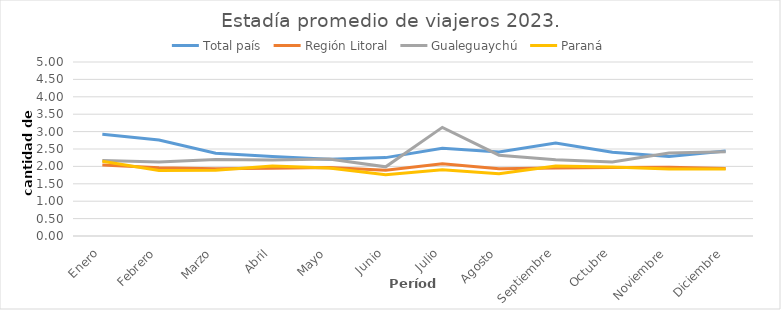
| Category | Total país | Región Litoral | Gualeguaychú | Paraná |
|---|---|---|---|---|
| Enero | 2.921 | 2.038 | 2.171 | 2.15 |
| Febrero | 2.757 | 1.963 | 2.128 | 1.882 |
| Marzo | 2.376 | 1.932 | 2.2 | 1.89 |
| Abril | 2.285 | 1.948 | 2.183 | 2.012 |
| Mayo | 2.205 | 1.969 | 2.214 | 1.953 |
| Junio | 2.253 | 1.893 | 1.987 | 1.761 |
| Julio | 2.524 | 2.073 | 3.122 | 1.907 |
| Agosto | 2.417 | 1.935 | 2.322 | 1.786 |
| Septiembre | 2.674 | 1.953 | 2.19 | 2.011 |
| Octubre | 2.408 | 1.965 | 2.127 | 1.986 |
| Noviembre | 2.281 | 1.973 | 2.387 | 1.925 |
| Diciembre | 2.441 | 1.94 | 2.42 | 1.927 |